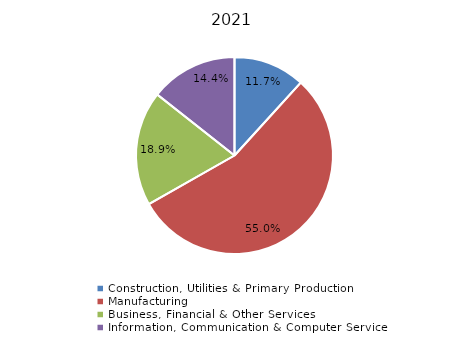
| Category | 2021 |
|---|---|
| Construction, Utilities & Primary Production  | 0.117 |
| Manufacturing  | 0.55 |
| Business, Financial & Other Services | 0.189 |
| Information, Communication & Computer Services | 0.144 |